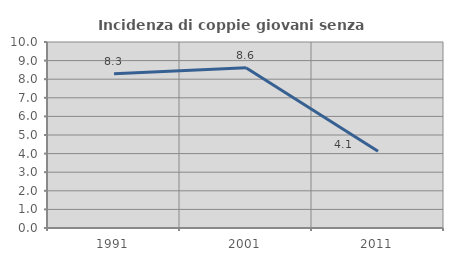
| Category | Incidenza di coppie giovani senza figli |
|---|---|
| 1991.0 | 8.291 |
| 2001.0 | 8.616 |
| 2011.0 | 4.128 |